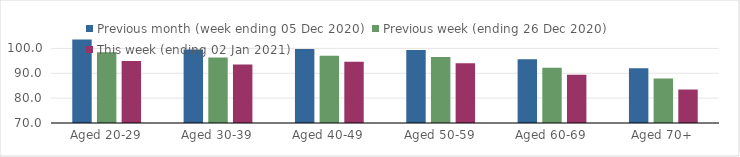
| Category | Previous month (week ending 05 Dec 2020) | Previous week (ending 26 Dec 2020) | This week (ending 02 Jan 2021) |
|---|---|---|---|
| Aged 20-29 | 103.62 | 98.44 | 94.92 |
| Aged 30-39 | 99.53 | 96.38 | 93.53 |
| Aged 40-49 | 99.82 | 97.08 | 94.61 |
| Aged 50-59 | 99.37 | 96.53 | 94.02 |
| Aged 60-69 | 95.65 | 92.18 | 89.45 |
| Aged 70+ | 92.07 | 87.89 | 83.47 |